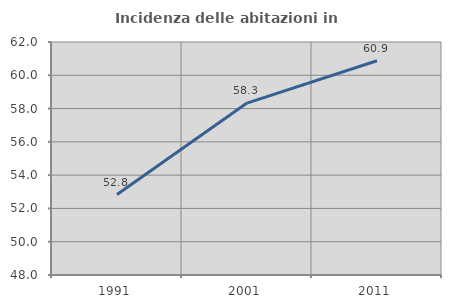
| Category | Incidenza delle abitazioni in proprietà  |
|---|---|
| 1991.0 | 52.836 |
| 2001.0 | 58.33 |
| 2011.0 | 60.871 |